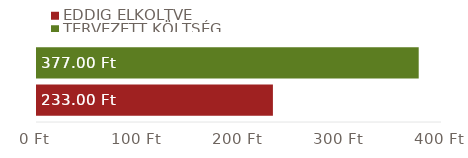
| Category | EDDIG ELKÖLTVE | TERVEZETT KÖLTSÉG |
|---|---|---|
| ÖSSZESEN | 233 | 377 |